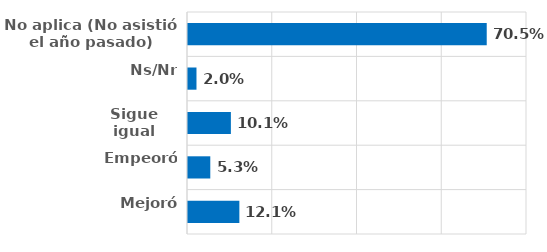
| Category | Series 0 |
|---|---|
| Mejoró | 0.121 |
| Empeoró | 0.053 |
| Sigue igual | 0.101 |
| Ns/Nr | 0.02 |
| No aplica (No asistió el año pasado) | 0.705 |